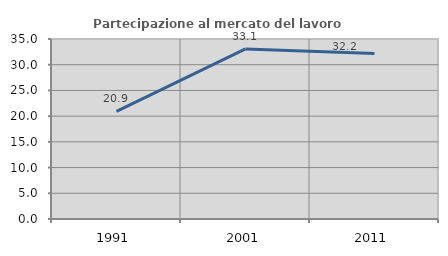
| Category | Partecipazione al mercato del lavoro  femminile |
|---|---|
| 1991.0 | 20.946 |
| 2001.0 | 33.071 |
| 2011.0 | 32.184 |